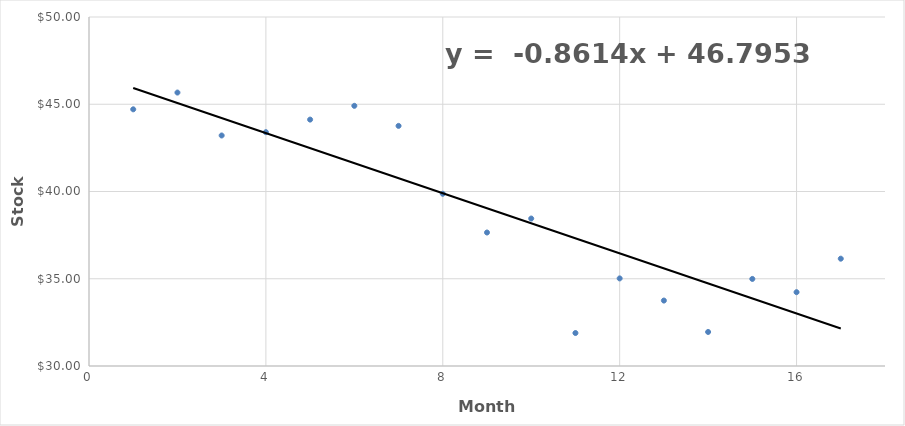
| Category | Series 0 |
|---|---|
| 1.0 | 44.71 |
| 2.0 | 45.67 |
| 3.0 | 43.21 |
| 4.0 | 43.4 |
| 5.0 | 44.12 |
| 6.0 | 44.91 |
| 7.0 | 43.76 |
| 8.0 | 39.87 |
| 9.0 | 37.65 |
| 10.0 | 38.45 |
| 11.0 | 31.89 |
| 12.0 | 35.02 |
| 13.0 | 33.75 |
| 14.0 | 31.95 |
| 15.0 | 34.99 |
| 16.0 | 34.23 |
| 17.0 | 36.15 |